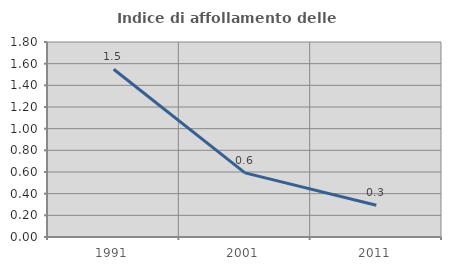
| Category | Indice di affollamento delle abitazioni  |
|---|---|
| 1991.0 | 1.548 |
| 2001.0 | 0.592 |
| 2011.0 | 0.292 |